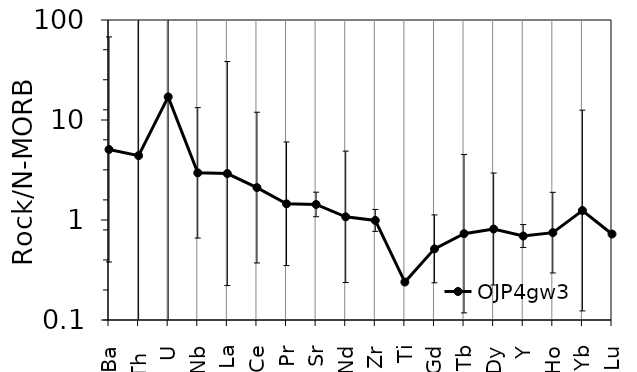
| Category | OJP4gw3 |
|---|---|
| Ba | 5.073 |
| Th  | 4.406 |
| U | 17.018 |
| Nb | 2.962 |
| La | 2.914 |
| Ce | 2.109 |
| Pr | 1.453 |
| Sr | 1.43 |
| Nd | 1.076 |
| Zr | 0.99 |
| Ti | 0.24 |
| Gd | 0.514 |
| Tb | 0.73 |
| Dy | 0.812 |
| Y | 0.692 |
| Ho | 0.748 |
| Yb | 1.244 |
| Lu | 0.724 |